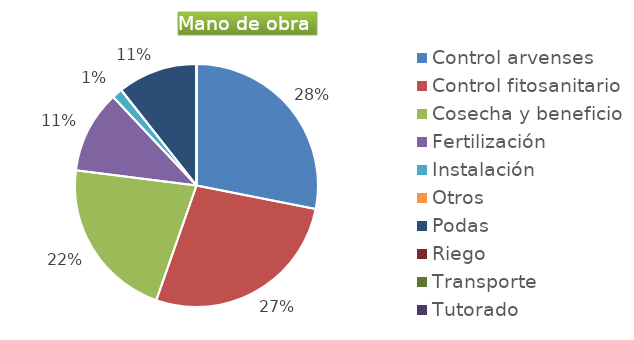
| Category | Series 0 |
|---|---|
| Control arvenses | 25728000 |
| Control fitosanitario | 24960000 |
| Cosecha y beneficio | 19807085.714 |
| Fertilización | 10048000 |
| Instalación | 1280000 |
| Otros | 0 |
| Podas | 9728000 |
| Riego | 0 |
| Transporte | 0 |
| Tutorado | 0 |